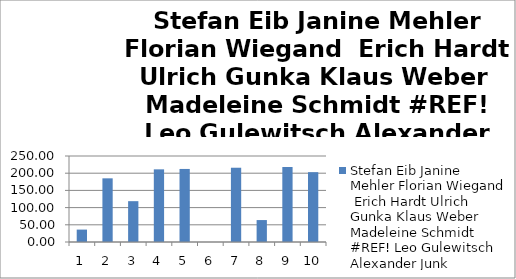
| Category | Stefan Eib Janine Mehler Florian Wiegand  Erich Hardt Ulrich Gunka Klaus Weber  Madeleine Schmidt #BEZUG! Leo Gulewitsch Alexander Junk |
|---|---|
| 0 | 36.063 |
| 1 | 185.07 |
| 2 | 118.69 |
| 3 | 211.2 |
| 4 | 212.36 |
| 5 | 0 |
| 6 | 215.9 |
| 7 | 63.774 |
| 8 | 217.96 |
| 9 | 203.01 |